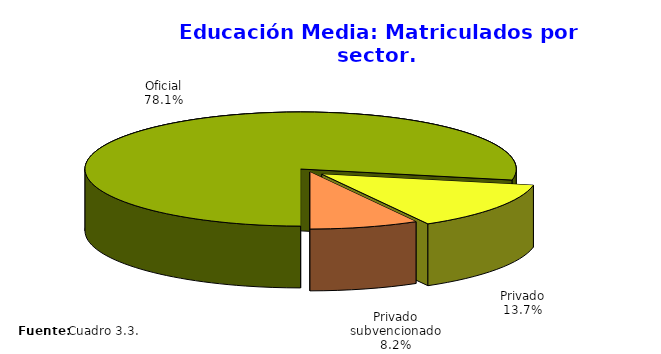
| Category | Series 0 |
|---|---|
| Oficial | 188661 |
| Privado | 33156 |
| Privado subvencionado | 19774 |